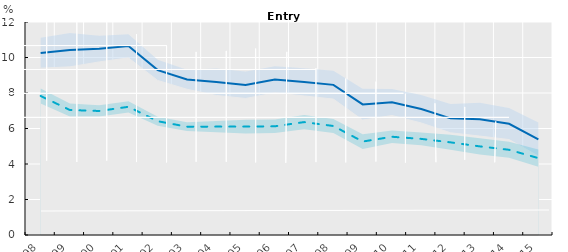
| Category | Highly digital-intensive sectors | Other sectors |
|---|---|---|
| 1998.0 | 10.257 | 7.832 |
| 1999.0 | 10.427 | 7.041 |
| 2000.0 | 10.491 | 6.987 |
| 2001.0 | 10.646 | 7.223 |
| 2002.0 | 9.289 | 6.41 |
| 2003.0 | 8.762 | 6.103 |
| 2004.0 | 8.619 | 6.106 |
| 2005.0 | 8.454 | 6.108 |
| 2006.0 | 8.758 | 6.124 |
| 2007.0 | 8.615 | 6.362 |
| 2008.0 | 8.458 | 6.141 |
| 2009.0 | 7.355 | 5.265 |
| 2010.0 | 7.482 | 5.535 |
| 2011.0 | 7.098 | 5.415 |
| 2012.0 | 6.573 | 5.22 |
| 2013.0 | 6.514 | 4.992 |
| 2014.0 | 6.264 | 4.801 |
| 2015.0 | 5.391 | 4.331 |